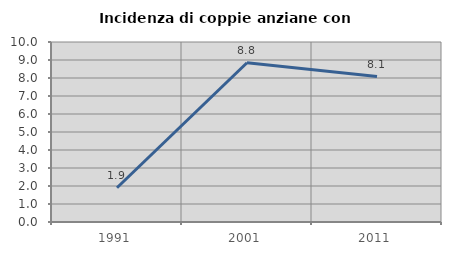
| Category | Incidenza di coppie anziane con figli |
|---|---|
| 1991.0 | 1.905 |
| 2001.0 | 8.85 |
| 2011.0 | 8.081 |